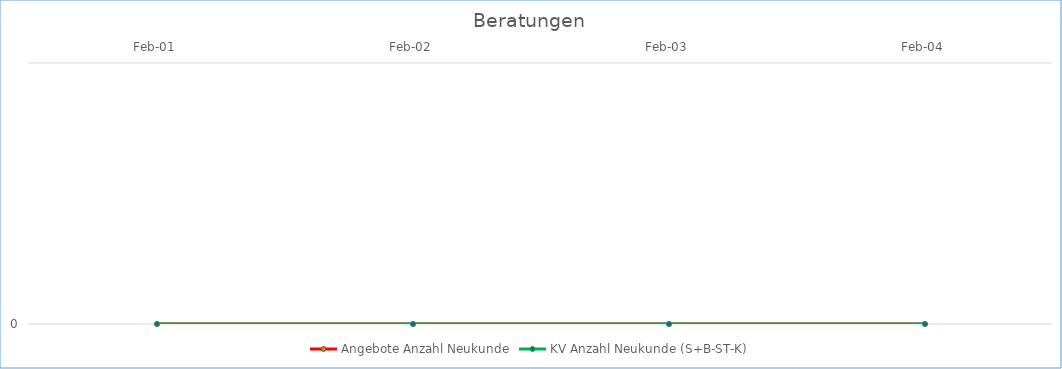
| Category | Angebote Anzahl Neukunde | KV Anzahl Neukunde (S+B-ST-K) |
|---|---|---|
| 2001-02-01 | 0 | 0 |
| 2002-02-01 | 0 | 0 |
| 2003-02-01 | 0 | 0 |
| 2004-02-01 | 0 | 0 |